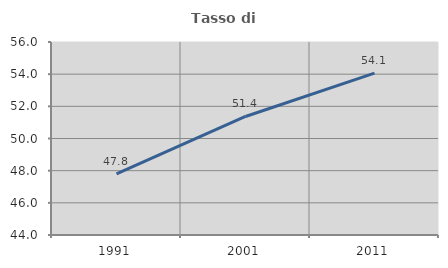
| Category | Tasso di occupazione   |
|---|---|
| 1991.0 | 47.794 |
| 2001.0 | 51.37 |
| 2011.0 | 54.064 |